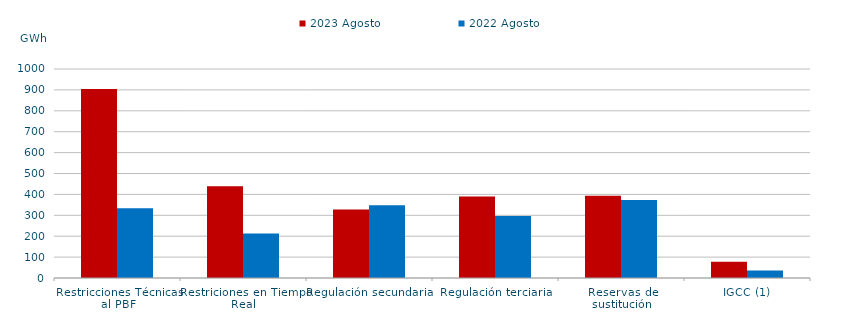
| Category | 2023 Agosto | 2022 Agosto |
|---|---|---|
| Restricciones Técnicas al PBF | 904.688 | 334.073 |
| Restriciones en Tiempo Real | 439.579 | 213.24 |
| Regulación secundaria | 328.239 | 347.729 |
| Regulación terciaria | 390.538 | 297.205 |
| Reservas de sustitución | 394.104 | 373.69 |
| IGCC (1) | 78.004 | 35.87 |